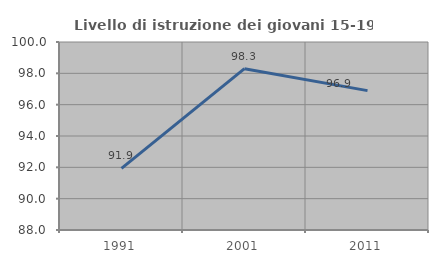
| Category | Livello di istruzione dei giovani 15-19 anni |
|---|---|
| 1991.0 | 91.933 |
| 2001.0 | 98.299 |
| 2011.0 | 96.897 |